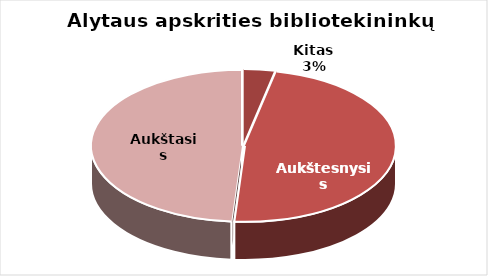
| Category | Series 0 |
|---|---|
| Kitas | 6 |
| Aukštesnysis | 85 |
| Aukštasis | 87 |